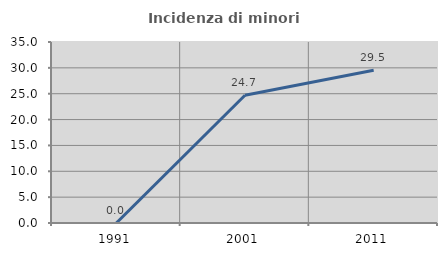
| Category | Incidenza di minori stranieri |
|---|---|
| 1991.0 | 0 |
| 2001.0 | 24.702 |
| 2011.0 | 29.539 |